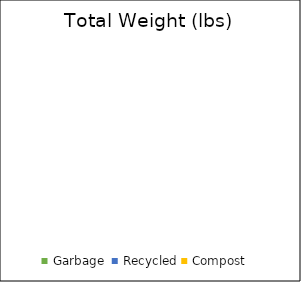
| Category | Total Volume (ft3) |
|---|---|
| Garbage  | 0 |
| Recycled | 0 |
| Compost   | 0 |